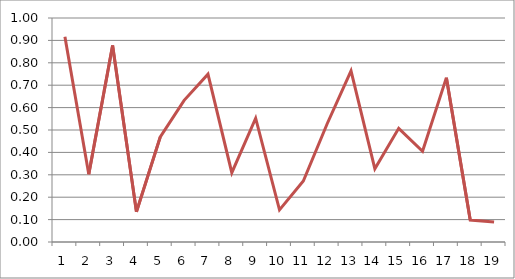
| Category | series |
|---|---|
| 0 | 0.916 |
| 1 | 0.303 |
| 2 | 0.877 |
| 3 | 0.134 |
| 4 | 0.469 |
| 5 | 0.633 |
| 6 | 0.749 |
| 7 | 0.309 |
| 8 | 0.553 |
| 9 | 0.143 |
| 10 | 0.272 |
| 11 | 0.528 |
| 12 | 0.764 |
| 13 | 0.327 |
| 14 | 0.507 |
| 15 | 0.405 |
| 16 | 0.734 |
| 17 | 0.098 |
| 18 | 0.089 |